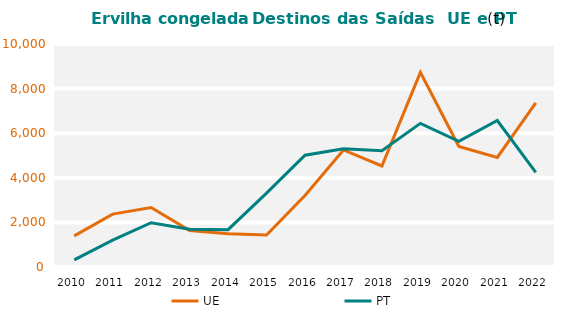
| Category | UE | PT |
|---|---|---|
| 2010.0 | 1395.575 | 321.061 |
| 2011.0 | 2371.848 | 1203.766 |
| 2012.0 | 2669.305 | 1984.683 |
| 2013.0 | 1634.462 | 1691.499 |
| 2014.0 | 1493.694 | 1673.424 |
| 2015.0 | 1432.87 | 3315.787 |
| 2016.0 | 3204.575 | 5015.437 |
| 2017.0 | 5247.969 | 5303.063 |
| 2018.0 | 4530.396 | 5215.809 |
| 2019.0 | 8728.04 | 6441.147 |
| 2020.0 | 5403.307 | 5634.806 |
| 2021.0 | 4913.681 | 6569.217 |
| 2022.0 | 7355.668 | 4242.733 |